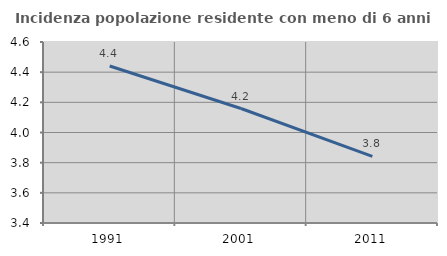
| Category | Incidenza popolazione residente con meno di 6 anni |
|---|---|
| 1991.0 | 4.441 |
| 2001.0 | 4.159 |
| 2011.0 | 3.842 |